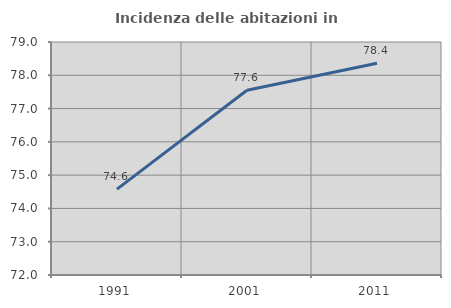
| Category | Incidenza delle abitazioni in proprietà  |
|---|---|
| 1991.0 | 74.581 |
| 2001.0 | 77.551 |
| 2011.0 | 78.363 |